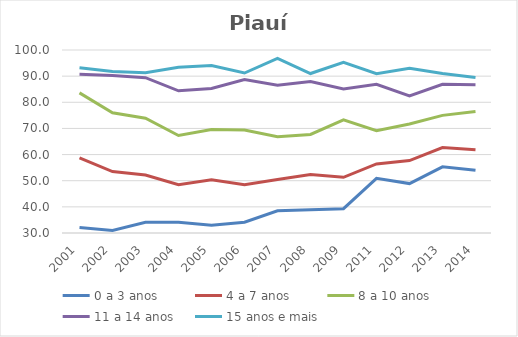
| Category | 0 a 3 anos | 4 a 7 anos | 8 a 10 anos | 11 a 14 anos | 15 anos e mais |
|---|---|---|---|---|---|
| 2001.0 | 32.1 | 58.7 | 83.6 | 90.7 | 93.2 |
| 2002.0 | 31 | 53.5 | 76 | 90.2 | 91.8 |
| 2003.0 | 34.1 | 52.2 | 73.9 | 89.4 | 91.3 |
| 2004.0 | 34.1 | 48.5 | 67.3 | 84.4 | 93.4 |
| 2005.0 | 33 | 50.4 | 69.6 | 85.3 | 94.1 |
| 2006.0 | 34.1 | 48.5 | 69.4 | 88.7 | 91.2 |
| 2007.0 | 38.5 | 50.5 | 66.8 | 86.5 | 96.8 |
| 2008.0 | 38.9 | 52.4 | 67.7 | 87.9 | 91 |
| 2009.0 | 39.3 | 51.3 | 73.3 | 85.1 | 95.3 |
| 2011.0 | 50.9 | 56.4 | 69.1 | 86.9 | 90.9 |
| 2012.0 | 48.9 | 57.7 | 71.7 | 82.4 | 93 |
| 2013.0 | 55.3 | 62.7 | 75 | 86.9 | 91 |
| 2014.0 | 54 | 61.8 | 76.5 | 86.7 | 89.5 |